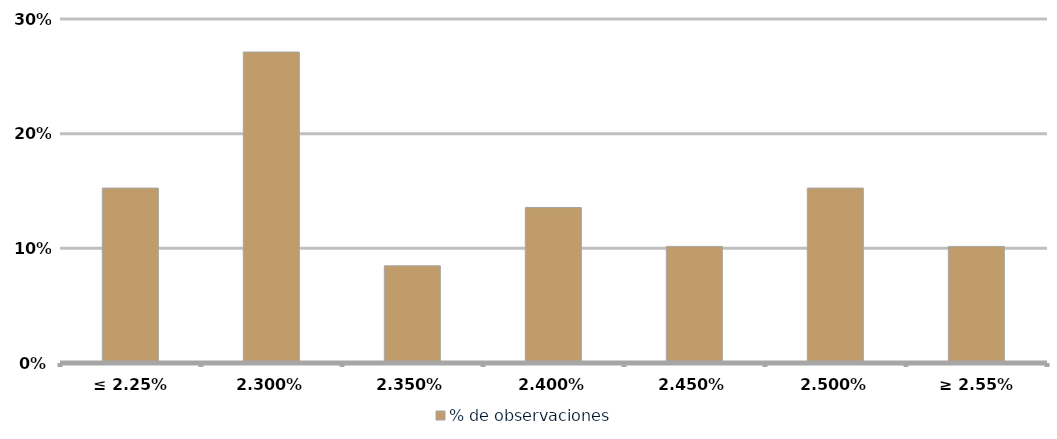
| Category | % de observaciones  |
|---|---|
| ≤ 2.25% | 0.153 |
| 2.30% | 0.271 |
| 2.35% | 0.085 |
| 2.40% | 0.136 |
| 2.45% | 0.102 |
| 2.50% | 0.153 |
| ≥ 2.55% | 0.102 |